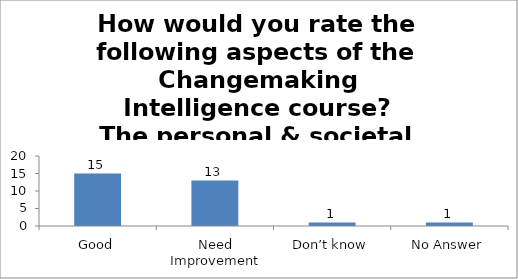
| Category | How would you rate the following aspects of the Changemaking Intelligence course?
The personal & societal outcomes of the course. |
|---|---|
| Good | 15 |
| Need Improvement | 13 |
| Don’t know | 1 |
| No Answer | 1 |